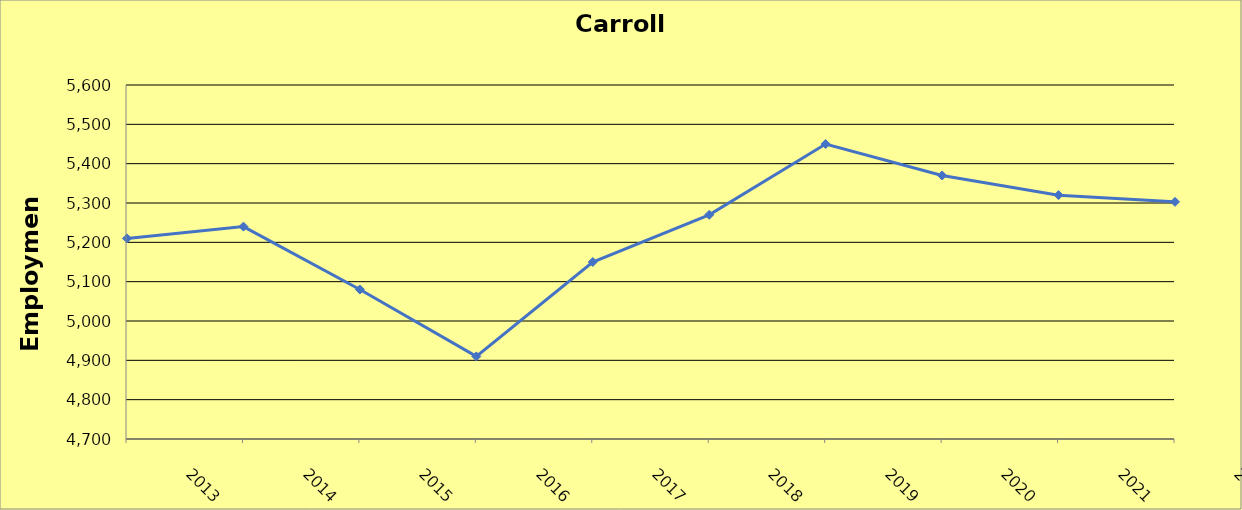
| Category | Carroll County |
|---|---|
| 2013.0 | 5210 |
| 2014.0 | 5240 |
| 2015.0 | 5080 |
| 2016.0 | 4910 |
| 2017.0 | 5150 |
| 2018.0 | 5270 |
| 2019.0 | 5450 |
| 2020.0 | 5370 |
| 2021.0 | 5320 |
| 2022.0 | 5303 |